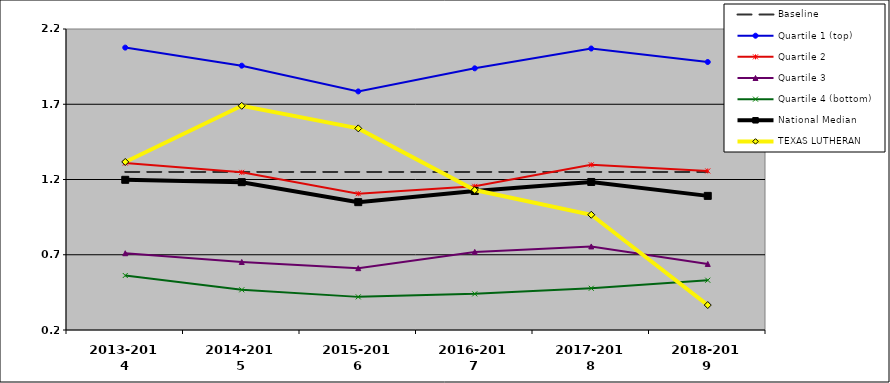
| Category | Baseline | Quartile 1 (top) | Quartile 2 | Quartile 3 | Quartile 4 (bottom) | National Median | TEXAS LUTHERAN |
|---|---|---|---|---|---|---|---|
| 2013-2014 | 1.25 | 2.076 | 1.309 | 0.71 | 0.562 | 1.198 | 1.317 |
| 2014-2015 | 1.25 | 1.956 | 1.248 | 0.652 | 0.467 | 1.182 | 1.69 |
| 2015-2016 | 1.25 | 1.785 | 1.106 | 0.611 | 0.42 | 1.049 | 1.54 |
| 2016-2017 | 1.25 | 1.939 | 1.155 | 0.719 | 0.44 | 1.123 | 1.13 |
| 2017-2018 | 1.25 | 2.07 | 1.297 | 0.755 | 0.477 | 1.184 | 0.966 |
| 2018-2019 | 1.25 | 1.981 | 1.257 | 0.639 | 0.531 | 1.091 | 0.366 |